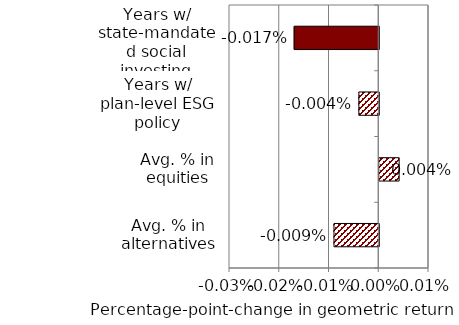
| Category | Series 0 |
|---|---|
| Avg. % in alternatives | 0 |
| Avg. % in equities | 0 |
| Years w/ plan-level ESG policy | 0 |
| Years w/ state-mandated social investing | 0 |